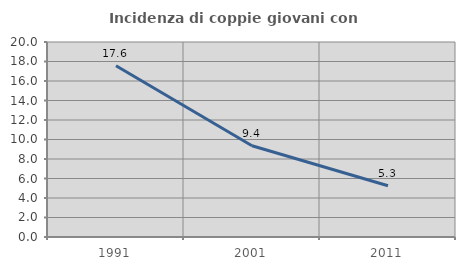
| Category | Incidenza di coppie giovani con figli |
|---|---|
| 1991.0 | 17.563 |
| 2001.0 | 9.365 |
| 2011.0 | 5.251 |